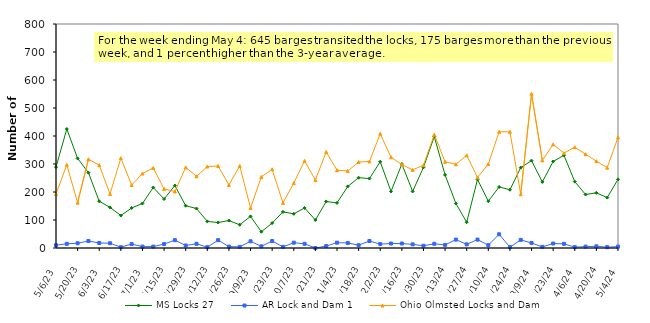
| Category | MS Locks 27 | AR Lock and Dam 1 | Ohio Olmsted Locks and Dam |
|---|---|---|---|
| 5/6/23 | 289 | 10 | 193 |
| 5/13/23 | 425 | 15 | 297 |
| 5/20/23 | 320 | 17 | 162 |
| 5/27/23 | 269 | 25 | 317 |
| 6/3/23 | 167 | 18 | 296 |
| 6/10/23 | 145 | 17 | 193 |
| 6/17/23 | 116 | 3 | 321 |
| 6/24/23 | 143 | 14 | 225 |
| 7/1/23 | 159 | 5 | 266 |
| 7/8/23 | 216 | 5 | 286 |
| 7/15/23 | 175 | 14 | 211 |
| 7/22/23 | 223 | 28 | 202 |
| 7/29/23 | 151 | 9 | 288 |
| 8/5/23 | 141 | 15 | 256 |
| 8/12/23 | 95 | 3 | 291 |
| 8/19/23 | 91 | 28 | 293 |
| 8/26/23 | 98 | 5 | 225 |
| 9/2/23 | 83 | 4 | 293 |
| 9/9/23 | 113 | 24 | 143 |
| 9/16/23 | 58 | 6 | 254 |
| 9/23/23 | 89 | 25 | 281 |
| 9/30/23 | 129 | 4 | 161 |
| 10/7/23 | 122 | 19 | 232 |
| 10/14/23 | 143 | 15 | 311 |
| 10/21/23 | 100 | 0 | 243 |
| 10/28/23 | 166 | 7 | 343 |
| 11/4/23 | 161 | 19 | 278 |
| 11/11/23 | 220 | 18 | 275 |
| 11/18/23 | 251 | 10 | 307 |
| 11/25/23 | 248 | 25 | 309 |
| 12/2/23 | 308 | 14 | 408 |
| 12/9/23 | 202 | 16 | 324 |
| 12/16/23 | 300 | 16 | 298 |
| 12/23/23 | 202 | 13 | 279 |
| 12/30/23 | 288 | 8 | 296 |
| 1/6/24 | 398 | 15 | 405 |
| 1/13/24 | 261 | 11 | 308 |
| 1/20/24 | 159 | 30 | 299 |
| 1/27/24 | 92 | 13 | 331 |
| 2/3/24 | 245 | 30 | 252 |
| 2/10/24 | 167 | 10 | 300 |
| 2/17/24 | 218 | 49 | 415 |
| 2/24/24 | 208 | 3 | 415 |
| 3/2/24 | 287 | 29 | 192 |
| 3/9/24 | 312 | 18 | 551 |
| 3/16/24 | 236 | 4 | 313 |
| 3/23/24 | 309 | 16 | 370 |
| 3/30/24 | 331 | 15 | 339 |
| 4/6/24 | 237 | 3 | 360 |
| 4/13/24 | 191 | 5 | 335 |
| 4/20/24 | 197 | 6 | 310 |
| 4/27/24 | 180 | 3 | 287 |
| 5/4/24 | 245 | 5 | 395 |